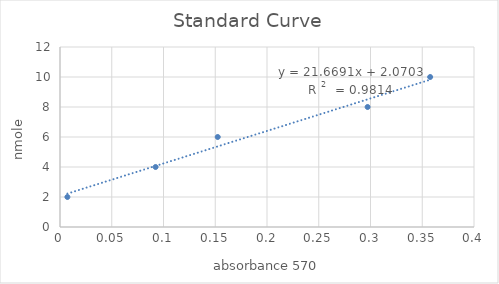
| Category | Series 0 |
|---|---|
| 0.007150000000000101 | 2 |
| 0.09235000000000004 | 4 |
| 0.15239999999999998 | 6 |
| 0.2972 | 8 |
| 0.3576499999999999 | 10 |